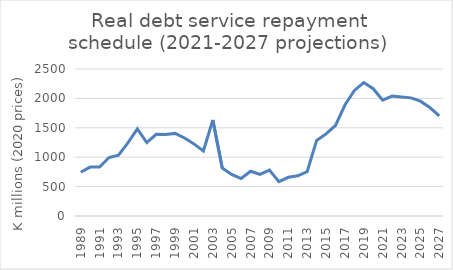
| Category | Projected debt service repayment schedule |
|---|---|
| 1989.0 | 744.339 |
| 1990.0 | 831.465 |
| 1991.0 | 833.862 |
| 1992.0 | 994.971 |
| 1993.0 | 1035.418 |
| 1994.0 | 1243.118 |
| 1995.0 | 1479.918 |
| 1996.0 | 1248.042 |
| 1997.0 | 1389.84 |
| 1998.0 | 1386.371 |
| 1999.0 | 1404.791 |
| 2000.0 | 1326.356 |
| 2001.0 | 1226.082 |
| 2002.0 | 1105.325 |
| 2003.0 | 1632.942 |
| 2004.0 | 815.096 |
| 2005.0 | 706.65 |
| 2006.0 | 636.776 |
| 2007.0 | 760.728 |
| 2008.0 | 706.984 |
| 2009.0 | 779.434 |
| 2010.0 | 582.944 |
| 2011.0 | 658.058 |
| 2012.0 | 683.934 |
| 2013.0 | 755.199 |
| 2014.0 | 1285.172 |
| 2015.0 | 1396.415 |
| 2016.0 | 1539.618 |
| 2017.0 | 1887.764 |
| 2018.0 | 2134.957 |
| 2019.0 | 2269.59 |
| 2020.0 | 2165.1 |
| 2021.0 | 1968.885 |
| 2022.0 | 2039.742 |
| 2023.0 | 2024.241 |
| 2024.0 | 2008.876 |
| 2025.0 | 1952.447 |
| 2026.0 | 1844.384 |
| 2027.0 | 1704.617 |